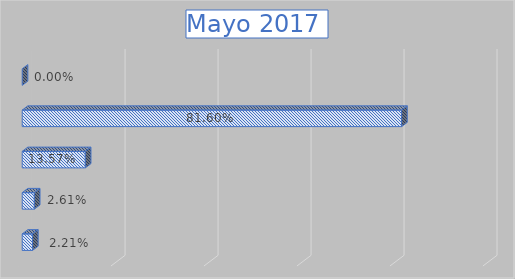
| Category | Series 0 |
|---|---|
| CDU | 0.022 |
| CMC | 0.026 |
| CP | 0.136 |
| PE | 0.816 |
| LP | 0 |